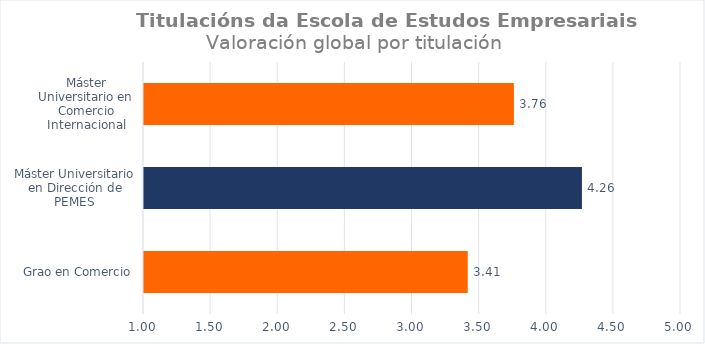
| Category | Series 0 |
|---|---|
| Grao en Comercio | 3.412 |
| Máster Universitario en Dirección de PEMES | 4.262 |
| Máster Universitario en Comercio Internacional | 3.756 |